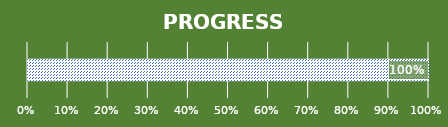
| Category | PROGRESS |
|---|---|
| 0 | 1 |